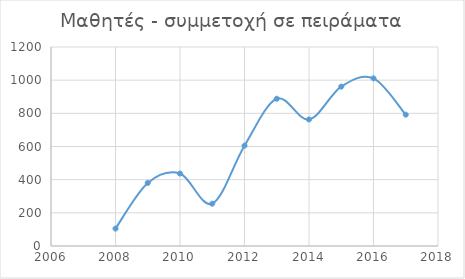
| Category | Series 0 |
|---|---|
| 2008.0 | 105 |
| 2009.0 | 380 |
| 2010.0 | 437 |
| 2011.0 | 255 |
| 2012.0 | 605 |
| 2013.0 | 888 |
| 2014.0 | 763 |
| 2015.0 | 961 |
| 2016.0 | 1011 |
| 2017.0 | 792 |